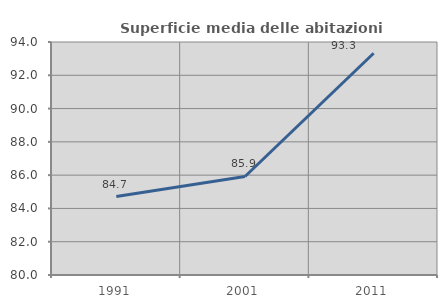
| Category | Superficie media delle abitazioni occupate |
|---|---|
| 1991.0 | 84.711 |
| 2001.0 | 85.921 |
| 2011.0 | 93.322 |